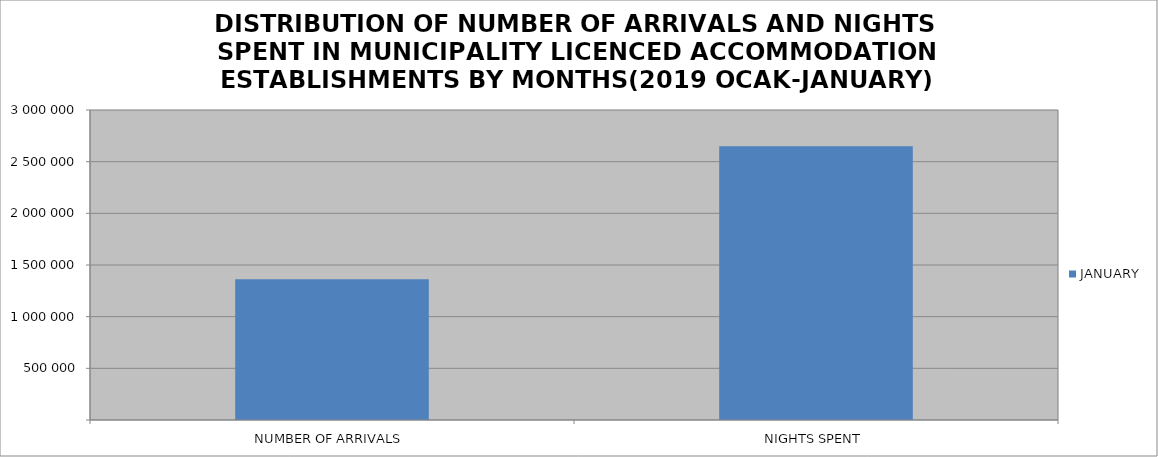
| Category | JANUARY |
|---|---|
| NUMBER OF ARRIVALS | 1363187 |
| NIGHTS SPENT | 2649437 |